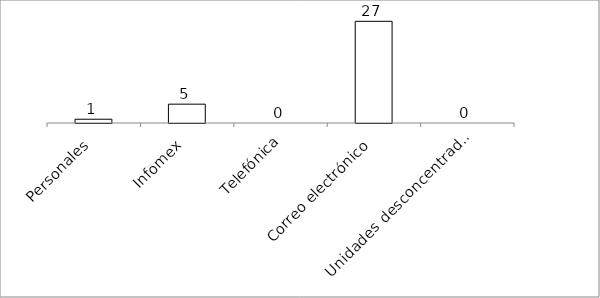
| Category | Series 0 |
|---|---|
| Personales | 1 |
| Infomex | 5 |
| Telefónica | 0 |
| Correo electrónico | 27 |
| Unidades desconcentradas | 0 |